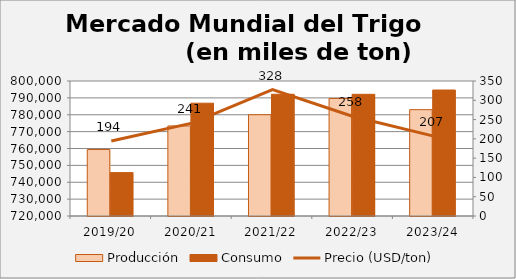
| Category | Producción | Consumo |
|---|---|---|
| 2019/20 | 759391 | 745710 |
| 2020/21 | 773366 | 786850 |
| 2021/22 | 780014 | 792131 |
| 2022/23 | 789655 | 792118 |
| 2023/24 | 783008 | 794656 |